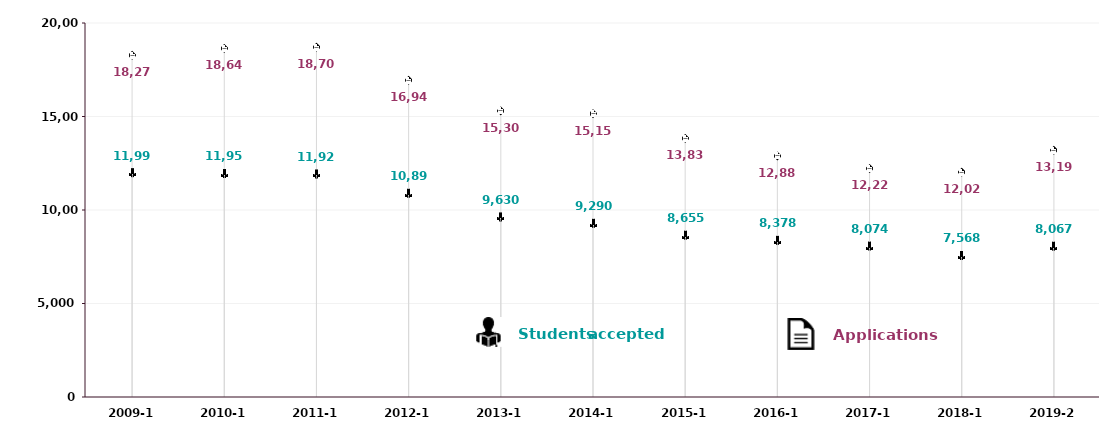
| Category | Applications | Students Accepted |
|---|---|---|
| 2009-10 | 18273 | 11998 |
| 2010-11 | 18642 | 11952 |
| 2011-12 | 18707 | 11927 |
| 2012-13 | 16944 | 10897 |
| 2013-14 | 15300 | 9630 |
| 2014-15 | 15157 | 9290 |
| 2015-16 | 13833 | 8655 |
| 2016-17 | 12889 | 8378 |
| 2017-18 | 12221 | 8074 |
| 2018-19 | 12028 | 7568 |
| 2019-20 | 13198 | 8067 |